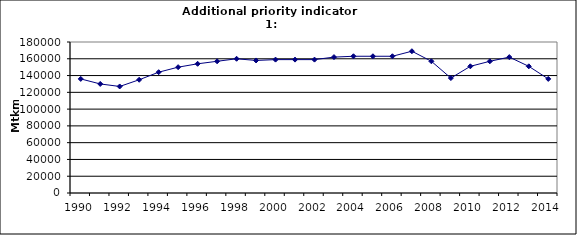
| Category | Freight transport on road, Mtkm |
|---|---|
| 1990 | 136000 |
| 1991 | 130000 |
| 1992 | 127000 |
| 1993 | 135000 |
| 1994 | 144000 |
| 1995 | 150000 |
| 1996 | 154000 |
| 1997 | 157000 |
| 1998 | 160000 |
| 1999 | 158000 |
| 2000 | 159000 |
| 2001 | 159000 |
| 2002 | 159000 |
| 2003 | 162000 |
| 2004 | 163000 |
| 2005 | 163000 |
| 2006 | 163000 |
| 2007 | 169000 |
| 2008 | 157000 |
| 2009 | 137000 |
| 2010 | 151000 |
| 2011 | 157000 |
| 2012 | 162000 |
| 2013 | 151000 |
| 2014 | 136000 |